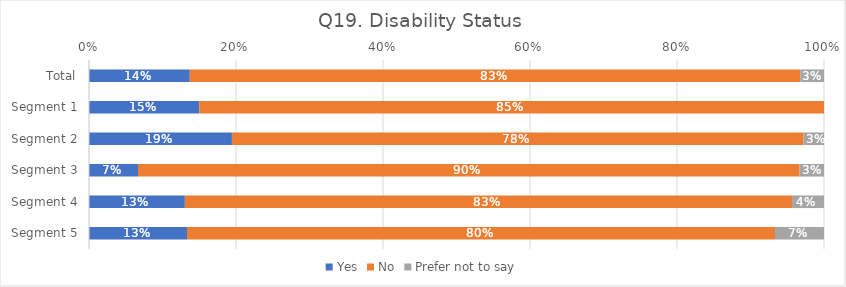
| Category | Yes | No | Prefer not to say |
|---|---|---|---|
| Total | 0.137 | 0.831 | 0.032 |
| Segment 1 | 0.15 | 0.85 | 0 |
| Segment 2 | 0.194 | 0.778 | 0.028 |
| Segment 3 | 0.067 | 0.9 | 0.033 |
| Segment 4 | 0.13 | 0.826 | 0.043 |
| Segment 5 | 0.133 | 0.8 | 0.067 |